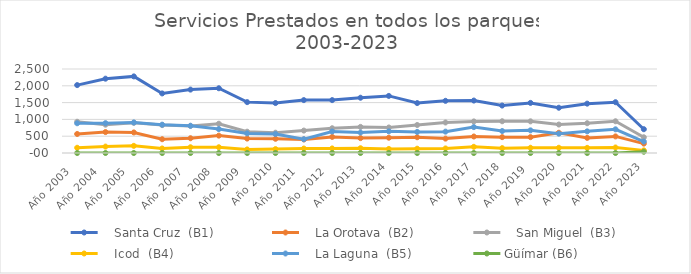
| Category |    Santa Cruz  (B1) |    La Orotava  (B2) |    San Miguel  (B3) |    Icod  (B4) |    La Laguna  (B5) | Güímar (B6) |
|---|---|---|---|---|---|---|
| Año 2003   | 2021 | 566 | 930 | 156 | 885 | 0 |
| Año 2004   | 2212 | 623 | 843 | 191 | 888 | 0 |
| Año 2005   | 2280 | 612 | 898 | 213 | 910 | 0 |
| Año 2006   | 1773 | 410 | 830 | 134 | 843 | 0 |
| Año 2007   | 1887 | 439 | 807 | 171 | 811 | 0 |
| Año 2008   | 1927 | 517 | 871 | 171 | 712 | 0 |
| Año 2009   | 1514 | 429 | 634 | 106 | 584 | 0 |
| Año 2010 | 1487 | 423 | 604 | 116 | 566 | 0 |
| Año 2011   | 1574 | 402 | 667 | 133 | 411 | 0 |
| Año 2012   | 1574 | 479 | 737 | 136 | 641 | 0 |
| Año 2013  | 1645 | 443 | 777 | 142 | 609 | 0 |
| Año 2014 | 1699 | 455 | 759 | 121 | 644 | 0 |
| Año 2015 | 1486 | 469 | 833 | 128 | 628 | 0 |
| Año 2016 | 1553 | 428 | 908 | 136 | 636 | 0 |
| Año 2017 | 1561 | 491 | 939 | 184 | 771 | 0 |
| Año 2018 | 1412 | 472 | 945 | 145 | 654 | 0 |
| Año 2019  | 1491 | 472 | 942 | 156 | 674 | 0 |
| Año 2020 | 1347 | 603 | 847 | 156 | 576 | 0 |
| Año 2021 | 1469 | 450 | 886 | 153 | 644 | 0 |
| Año 2022 | 1512 | 494 | 944 | 164 | 705 | 0 |
| Año 2023 | 708 | 279 | 468 | 78 | 341 | 37 |